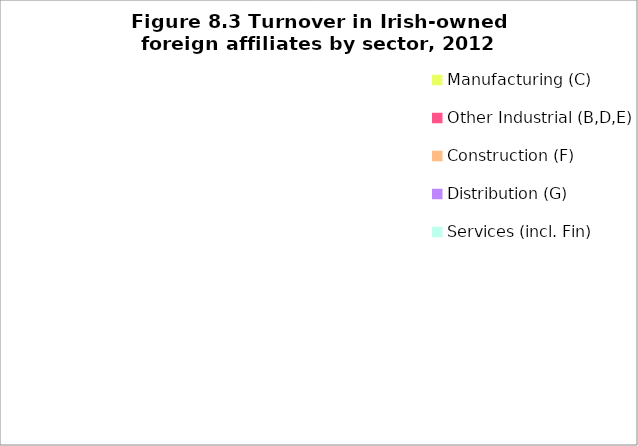
| Category | Series 1 |
|---|---|
| Manufacturing (C) | 0 |
| Other Industrial (B,D,E) | 0 |
| Construction (F) | 0 |
| Distribution (G) | 0 |
| Services (incl. Fin) | 0 |